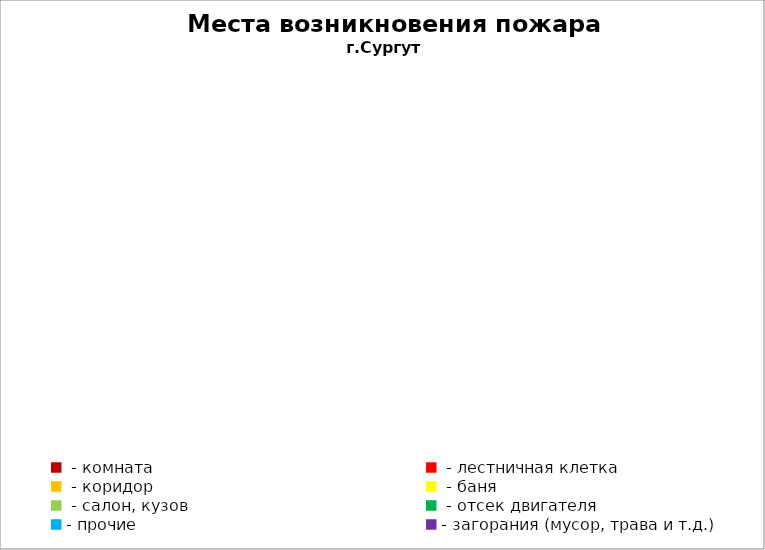
| Category | Места возникновения пожара |
|---|---|
|  - комната | 94 |
|  - лестничная клетка | 16 |
|  - коридор | 12 |
|  - баня | 52 |
|  - салон, кузов | 31 |
|  - отсек двигателя | 56 |
| - прочие | 124 |
| - загорания (мусор, трава и т.д.)  | 179 |